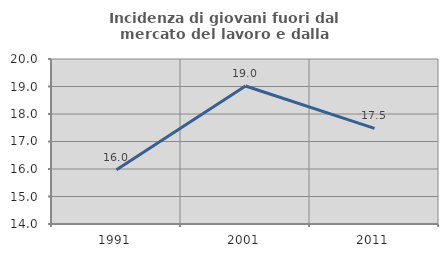
| Category | Incidenza di giovani fuori dal mercato del lavoro e dalla formazione  |
|---|---|
| 1991.0 | 15.97 |
| 2001.0 | 19.016 |
| 2011.0 | 17.48 |